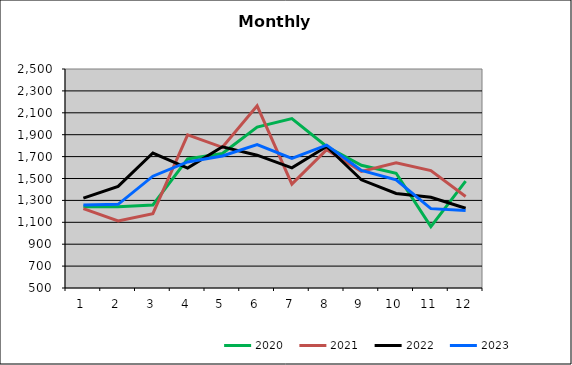
| Category | 2020 | 2021 | 2022 | 2023 |
|---|---|---|---|---|
| 0 | 1241.004 | 1224.945 | 1320.378 | 1257.222 |
| 1 | 1241.851 | 1112.955 | 1427.347 | 1264.176 |
| 2 | 1257.948 | 1179.01 | 1732.641 | 1520.992 |
| 3 | 1678.799 | 1897.827 | 1594.906 | 1650.894 |
| 4 | 1728.302 | 1784.624 | 1789.593 | 1705.362 |
| 5 | 1969.438 | 2163.63 | 1712.772 | 1808.838 |
| 6 | 2046.582 | 1448.352 | 1597.715 | 1683.625 |
| 7 | 1792.692 | 1763.243 | 1792.018 | 1805.162 |
| 8 | 1620.398 | 1564.861 | 1487.937 | 1574.353 |
| 9 | 1547.501 | 1643.384 | 1362.939 | 1488.484 |
| 10 | 1060.179 | 1572.259 | 1328.637 | 1224.765 |
| 11 | 1476.203 | 1336.135 | 1228.775 | 1208.029 |